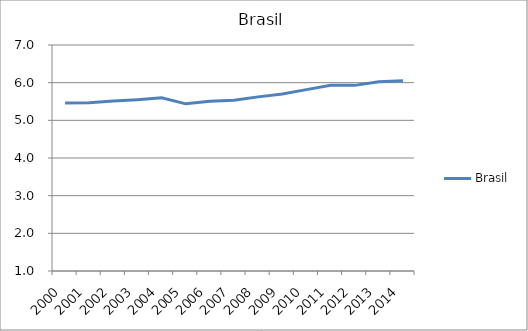
| Category | Brasil |
|---|---|
| 2000.0 | 5.458 |
| 2001.0 | 5.467 |
| 2002.0 | 5.513 |
| 2003.0 | 5.549 |
| 2004.0 | 5.599 |
| 2005.0 | 5.438 |
| 2006.0 | 5.507 |
| 2007.0 | 5.531 |
| 2008.0 | 5.623 |
| 2009.0 | 5.699 |
| 2010.0 | 5.816 |
| 2011.0 | 5.93 |
| 2012.0 | 5.928 |
| 2013.0 | 6.021 |
| 2014.0 | 6.051 |